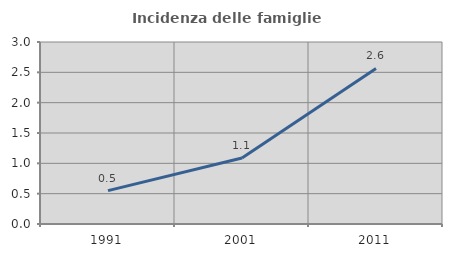
| Category | Incidenza delle famiglie numerose |
|---|---|
| 1991.0 | 0.549 |
| 2001.0 | 1.087 |
| 2011.0 | 2.564 |